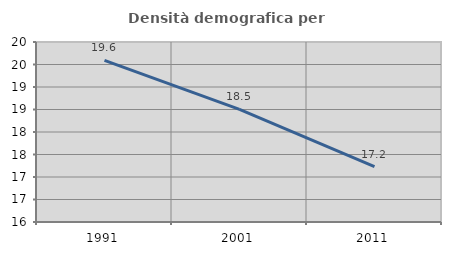
| Category | Densità demografica |
|---|---|
| 1991.0 | 19.591 |
| 2001.0 | 18.503 |
| 2011.0 | 17.231 |